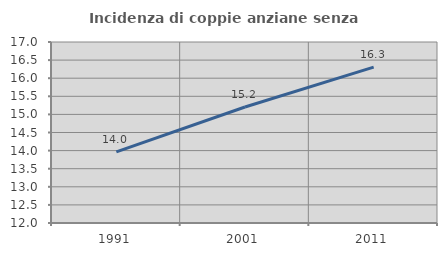
| Category | Incidenza di coppie anziane senza figli  |
|---|---|
| 1991.0 | 13.966 |
| 2001.0 | 15.204 |
| 2011.0 | 16.305 |